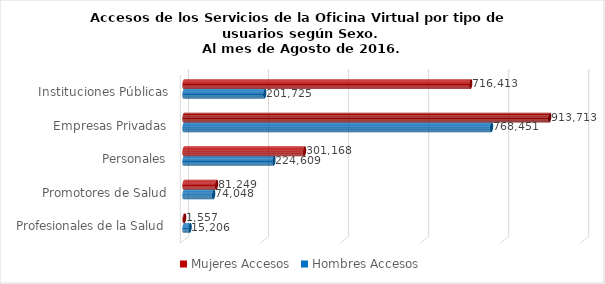
| Category | Mujeres | Hombres |
|---|---|---|
| Instituciones Públicas | 716413 | 201725 |
| Empresas Privadas | 913713 | 768451 |
| Personales | 301168 | 224609 |
| Promotores de Salud | 81249 | 74048 |
| Profesionales de la Salud | 1557 | 15206 |